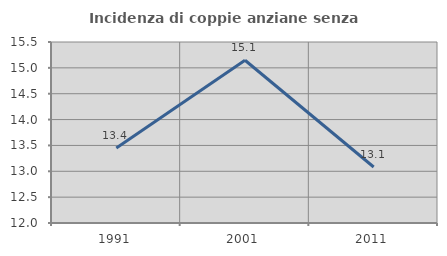
| Category | Incidenza di coppie anziane senza figli  |
|---|---|
| 1991.0 | 13.449 |
| 2001.0 | 15.148 |
| 2011.0 | 13.083 |